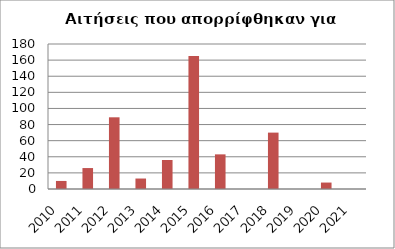
| Category | Series 1 |
|---|---|
| 2010.0 | 10 |
| 2011.0 | 26 |
| 2012.0 | 89 |
| 2013.0 | 13 |
| 2014.0 | 36 |
| 2015.0 | 165 |
| 2016.0 | 43 |
| 2017.0 | 0 |
| 2018.0 | 70 |
| 2019.0 | 0 |
| 2020.0 | 8 |
| 2021.0 | 0 |